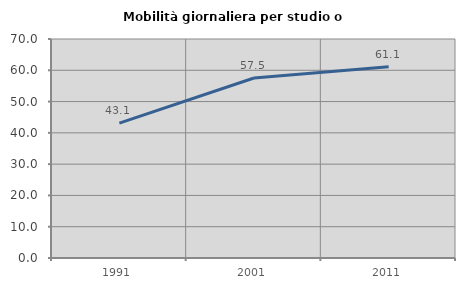
| Category | Mobilità giornaliera per studio o lavoro |
|---|---|
| 1991.0 | 43.123 |
| 2001.0 | 57.529 |
| 2011.0 | 61.1 |